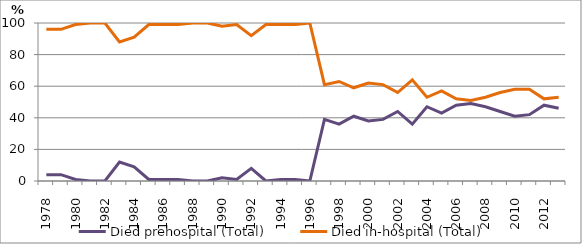
| Category | Died prehospital (Total) | Died in-hospital (Total) |
|---|---|---|
| 1978.0 | 4 | 96 |
| 1979.0 | 4 | 96 |
| 1980.0 | 1 | 99 |
| 1981.0 | 0 | 100 |
| 1982.0 | 0 | 100 |
| 1983.0 | 12 | 88 |
| 1984.0 | 9 | 91 |
| 1985.0 | 1 | 99 |
| 1986.0 | 1 | 99 |
| 1987.0 | 1 | 99 |
| 1988.0 | 0 | 100 |
| 1989.0 | 0 | 100 |
| 1990.0 | 2 | 98 |
| 1991.0 | 1 | 99 |
| 1992.0 | 8 | 92 |
| 1993.0 | 0 | 99 |
| 1994.0 | 1 | 99 |
| 1995.0 | 1 | 99 |
| 1996.0 | 0 | 100 |
| 1997.0 | 39 | 61 |
| 1998.0 | 36 | 63 |
| 1999.0 | 41 | 59 |
| 2000.0 | 38 | 62 |
| 2001.0 | 39 | 61 |
| 2002.0 | 44 | 56 |
| 2003.0 | 36 | 64 |
| 2004.0 | 47 | 53 |
| 2005.0 | 43 | 57 |
| 2006.0 | 48 | 52 |
| 2007.0 | 49 | 51 |
| 2008.0 | 47 | 53 |
| 2009.0 | 44 | 56 |
| 2010.0 | 41 | 58 |
| 2011.0 | 42 | 58 |
| 2012.0 | 48 | 52 |
| 2013.0 | 46 | 53 |